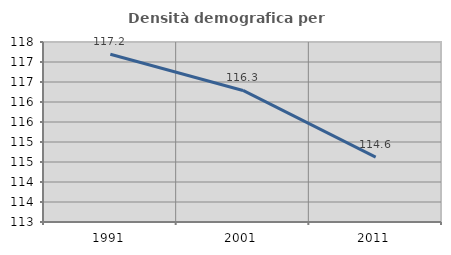
| Category | Densità demografica |
|---|---|
| 1991.0 | 117.193 |
| 2001.0 | 116.289 |
| 2011.0 | 114.621 |